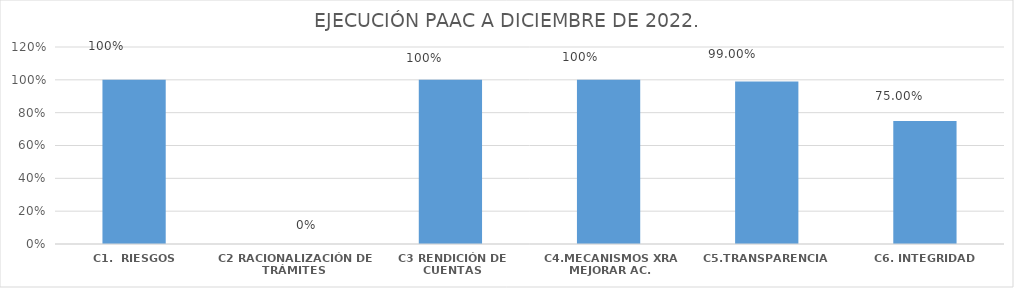
| Category | % CUMPLIMIENTO  |
|---|---|
| C1.  RIESGOS | 1 |
| C2 RACIONALIZACIÓN DE TRÁMITES | 0 |
| C3 RENDICIÓN DE CUENTAS | 1 |
| C4.MECANISMOS XRA MEJORAR AC. | 1 |
| C5.TRANSPARENCIA  | 0.99 |
| C6. INTEGRIDAD | 0.75 |